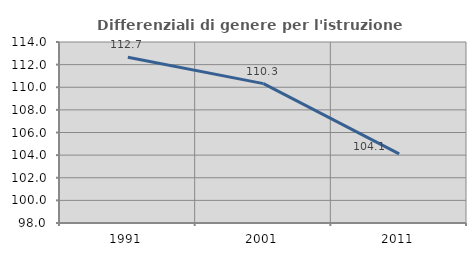
| Category | Differenziali di genere per l'istruzione superiore |
|---|---|
| 1991.0 | 112.654 |
| 2001.0 | 110.322 |
| 2011.0 | 104.114 |